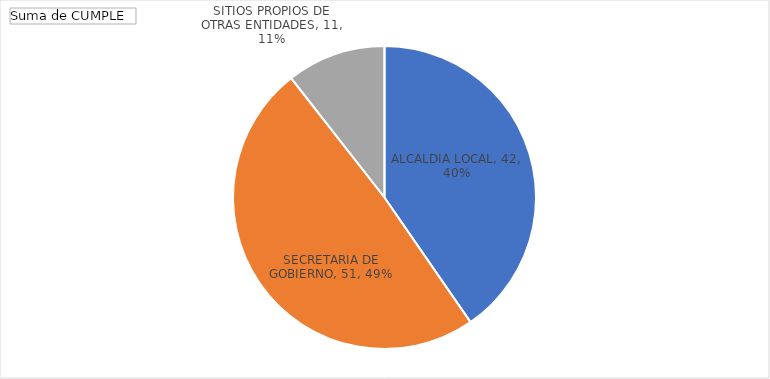
| Category | Total |
|---|---|
| ALCALDIA LOCAL | 42 |
| SECRETARIA DE GOBIERNO | 51 |
| SITIOS PROPIOS DE OTRAS ENTIDADES | 11 |